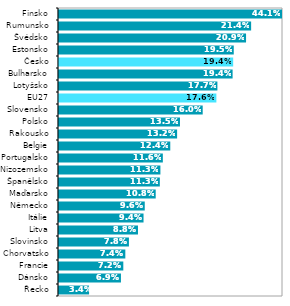
| Category | 2021* |
|---|---|
| Řecko | 0.034 |
| Dánsko | 0.069 |
| Francie | 0.072 |
| Chorvatsko | 0.074 |
| Slovinsko | 0.078 |
| Litva | 0.088 |
| Itálie | 0.094 |
| Německo | 0.096 |
| Maďarsko | 0.108 |
| Španělsko | 0.113 |
| Nizozemsko | 0.113 |
| Portugalsko | 0.116 |
| Belgie | 0.124 |
| Rakousko | 0.132 |
| Polsko | 0.135 |
| Slovensko | 0.16 |
| EU27 | 0.176 |
| Lotyšsko | 0.177 |
| Bulharsko | 0.194 |
| Česko | 0.194 |
| Estonsko | 0.195 |
| Švédsko | 0.209 |
| Rumunsko | 0.214 |
| Finsko | 0.441 |